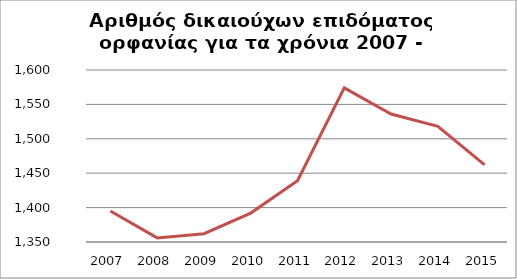
| Category |  1.395       1.356       1.362       1.392       1.439       1.574       1.536       1.518       1.462      |
|---|---|
| 2007.0 | 1395 |
| 2008.0 | 1356 |
| 2009.0 | 1362 |
| 2010.0 | 1392 |
| 2011.0 | 1439 |
| 2012.0 | 1574 |
| 2013.0 | 1536 |
| 2014.0 | 1518 |
| 2015.0 | 1462 |